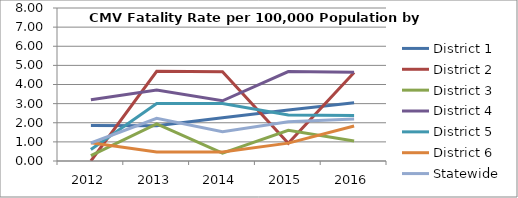
| Category | District 1 | District 2 | District 3 | District 4 | District 5 | District 6 | Statewide |
|---|---|---|---|---|---|---|---|
| 2012.0 | 1.856 | 0 | 0.282 | 3.206 | 0.6 | 0.955 | 0.94 |
| 2013.0 | 1.839 | 4.691 | 1.938 | 3.706 | 3.01 | 0.475 | 2.233 |
| 2014.0 | 2.258 | 4.671 | 0.407 | 3.15 | 3.008 | 0.471 | 1.53 |
| 2015.0 | 2.667 | 0.931 | 1.601 | 4.678 | 2.403 | 0.934 | 2.054 |
| 2016.0 | 3.043 | 4.627 | 1.046 | 4.64 | 2.384 | 1.833 | 2.198 |